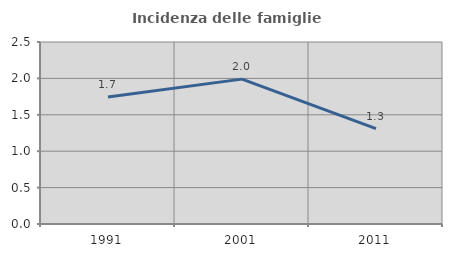
| Category | Incidenza delle famiglie numerose |
|---|---|
| 1991.0 | 1.744 |
| 2001.0 | 1.99 |
| 2011.0 | 1.31 |